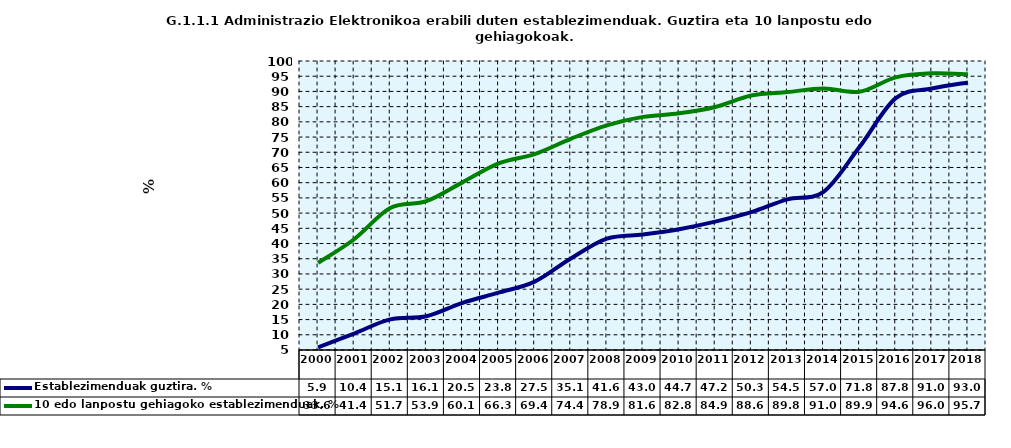
| Category | Establezimenduak guztira. % | 10 edo lanpostu gehiagoko establezimenduak. % |
|---|---|---|
| 2000.0 | 5.883 | 33.627 |
| 2001.0 | 10.421 | 41.411 |
| 2002.0 | 15.068 | 51.694 |
| 2003.0 | 16.098 | 53.904 |
| 2004.0 | 20.515 | 60.107 |
| 2005.0 | 23.837 | 66.349 |
| 2006.0 | 27.46 | 69.402 |
| 2007.0 | 35.078 | 74.42 |
| 2008.0 | 41.612 | 78.862 |
| 2009.0 | 42.972 | 81.627 |
| 2010.0 | 44.715 | 82.794 |
| 2011.0 | 47.2 | 84.9 |
| 2012.0 | 50.321 | 88.639 |
| 2013.0 | 54.524 | 89.774 |
| 2014.0 | 56.986 | 90.972 |
| 2015.0 | 71.8 | 89.9 |
| 2016.0 | 87.813 | 94.63 |
| 2017.0 | 90.959 | 95.964 |
| 2018.0 | 92.961 | 95.655 |